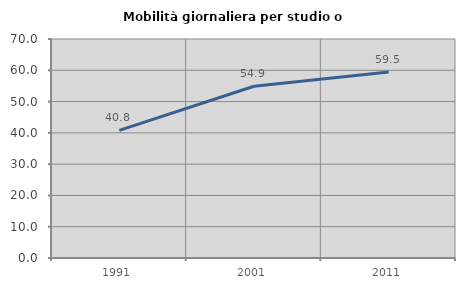
| Category | Mobilità giornaliera per studio o lavoro |
|---|---|
| 1991.0 | 40.78 |
| 2001.0 | 54.908 |
| 2011.0 | 59.459 |